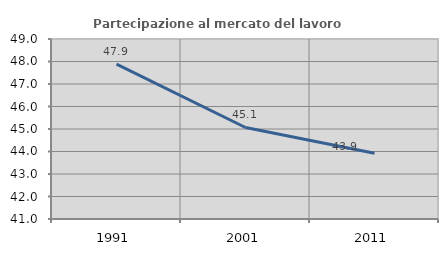
| Category | Partecipazione al mercato del lavoro  femminile |
|---|---|
| 1991.0 | 47.884 |
| 2001.0 | 45.067 |
| 2011.0 | 43.92 |